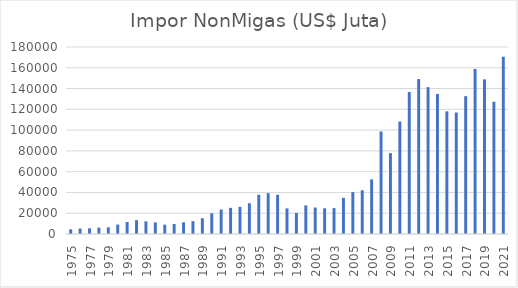
| Category | Impor NonMigas (US$ Juta) |
|---|---|
| 1975.0 | 4561.3 |
| 1976.0 | 5235.4 |
| 1977.0 | 5498.3 |
| 1978.0 | 6110.7 |
| 1979.0 | 6409 |
| 1980.0 | 9090.4 |
| 1981.0 | 11550.8 |
| 1982.0 | 13314.1 |
| 1983.0 | 12207 |
| 1984.0 | 11185.3 |
| 1985.0 | 8983.5 |
| 1986.0 | 9632 |
| 1987.0 | 11302.4 |
| 1988.0 | 12339.5 |
| 1989.0 | 15164.4 |
| 1990.0 | 19916.6 |
| 1991.0 | 23558.5 |
| 1992.0 | 25164.6 |
| 1993.0 | 26157.3 |
| 1994.0 | 29621.4 |
| 1995.0 | 37743.3 |
| 1996.0 | 39338.9 |
| 1997.0 | 37755.7 |
| 1998.0 | 24683.2 |
| 1999.0 | 20322.2 |
| 2000.0 | 27495.3 |
| 2001.0 | 25490.3 |
| 2002.0 | 24763.1 |
| 2003.0 | 24939.8 |
| 2004.0 | 34792.5 |
| 2005.0 | 40243.2 |
| 2006.0 | 42102.6 |
| 2007.0 | 52540.6 |
| 2008.0 | 98644.4 |
| 2009.0 | 77848.5 |
| 2010.0 | 108250.6 |
| 2011.0 | 136734.1 |
| 2012.0 | 149126.6 |
| 2013.0 | 141362.3 |
| 2014.0 | 134718.9 |
| 2015.0 | 118081.4 |
| 2016.0 | 116913.4 |
| 2017.0 | 132669.3 |
| 2018.0 | 158842.5 |
| 2019.0 | 148842.4 |
| 2020.0 | 127312 |
| 2021.0 | 170660.9 |